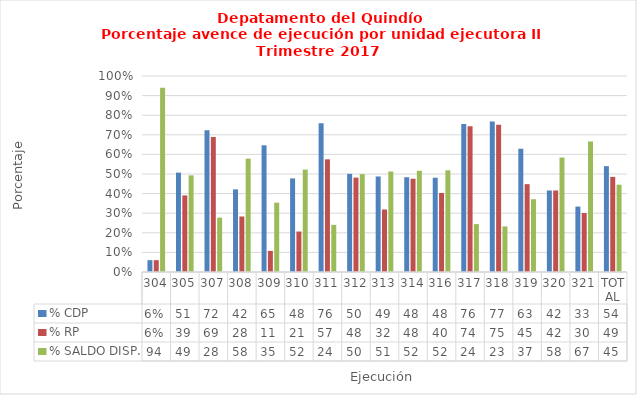
| Category | % CDP | % RP | % SALDO DISP. |
|---|---|---|---|
| 304 | 0.06 | 0.06 | 0.94 |
| 305 | 0.507 | 0.391 | 0.493 |
| 307 | 0.723 | 0.689 | 0.277 |
| 308 | 0.422 | 0.283 | 0.578 |
| 309 | 0.646 | 0.108 | 0.354 |
| 310 | 0.477 | 0.206 | 0.523 |
| 311 | 0.759 | 0.575 | 0.241 |
| 312 | 0.501 | 0.482 | 0.499 |
| 313 | 0.487 | 0.319 | 0.513 |
| 314 | 0.484 | 0.476 | 0.516 |
| 316 | 0.481 | 0.403 | 0.519 |
| 317 | 0.756 | 0.744 | 0.244 |
| 318 | 0.767 | 0.751 | 0.233 |
| 319 | 0.629 | 0.448 | 0.371 |
| 320 | 0.416 | 0.416 | 0.584 |
| 321 | 0.334 | 0.301 | 0.666 |
| TOTAL | 0.54 | 0.485 | 0.445 |